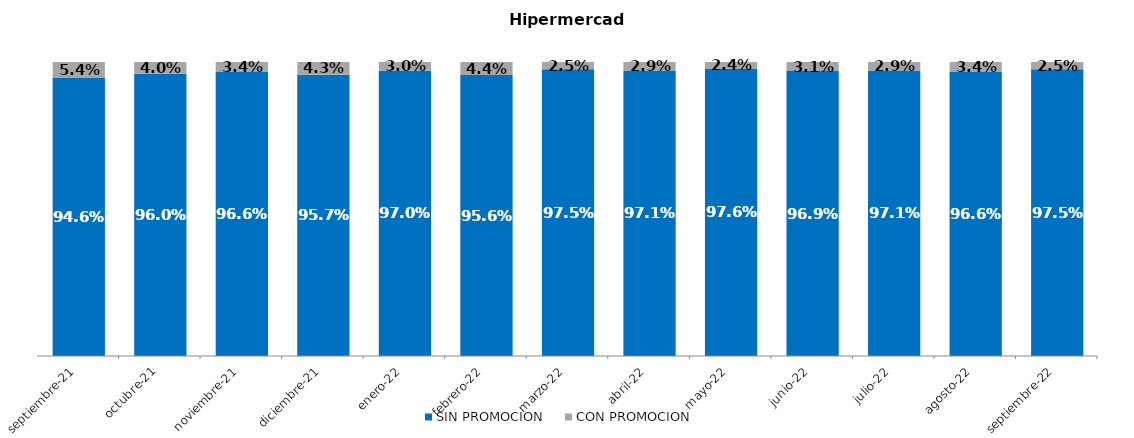
| Category | SIN PROMOCION   | CON PROMOCION   |
|---|---|---|
| 2021-09-01 | 0.946 | 0.054 |
| 2021-10-01 | 0.96 | 0.04 |
| 2021-11-01 | 0.966 | 0.034 |
| 2021-12-01 | 0.957 | 0.043 |
| 2022-01-01 | 0.97 | 0.03 |
| 2022-02-01 | 0.956 | 0.044 |
| 2022-03-01 | 0.975 | 0.025 |
| 2022-04-01 | 0.971 | 0.029 |
| 2022-05-01 | 0.976 | 0.024 |
| 2022-06-01 | 0.969 | 0.031 |
| 2022-07-01 | 0.971 | 0.029 |
| 2022-08-01 | 0.966 | 0.034 |
| 2022-09-01 | 0.975 | 0.025 |